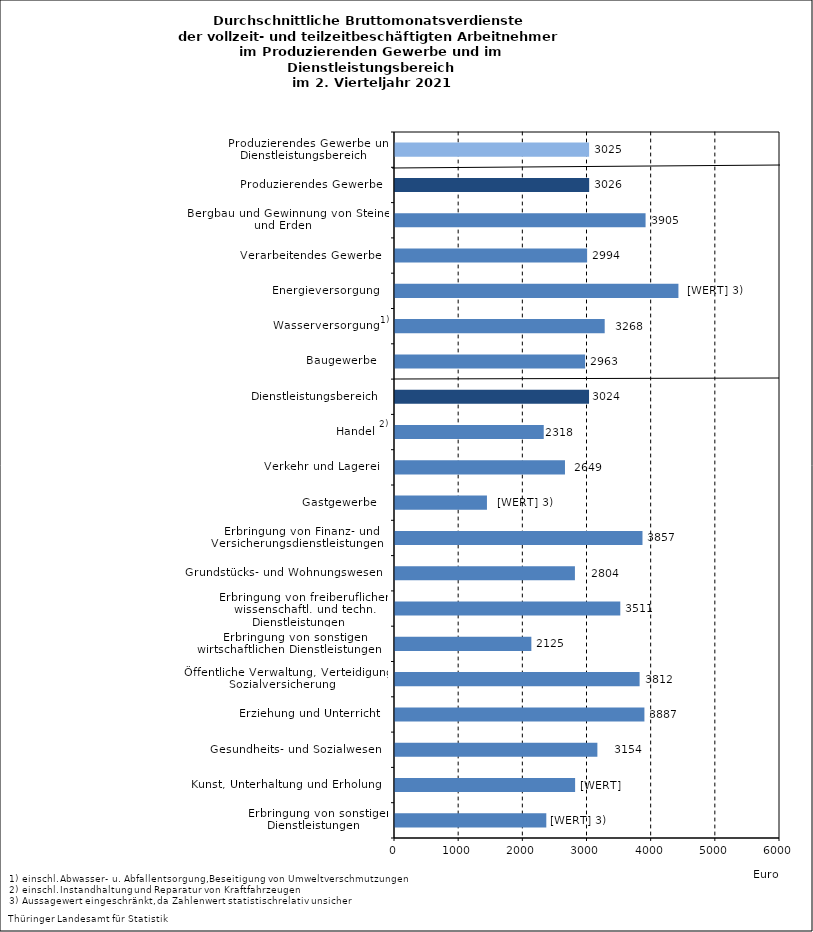
| Category | Series 0 |
|---|---|
| Erbringung von sonstigen Dienstleistungen    | 2358 |
| Kunst, Unterhaltung und Erholung    | 2807 |
| Gesundheits- und Sozialwesen    | 3154 |
| Erziehung und Unterricht    | 3887 |
| Öffentliche Verwaltung, Verteidigung, Sozialversicherung    | 3812 |
| Erbringung von sonstigen wirtschaftlichen Dienstleistungen    | 2125 |
| Erbringung von freiberuflichen, wissenschaftl. und techn. Dienstleistungen    | 3511 |
| Grundstücks- und Wohnungswesen    | 2804 |
| Erbringung von Finanz- und Versicherungsdienstleistungen    | 3857 |
| Gastgewerbe    | 1433 |
| Verkehr und Lagerei    | 2649 |
| Handel    | 2318 |
| Dienstleistungsbereich    | 3024 |
| Baugewerbe    | 2963 |
| Wasserversorgung    | 3268 |
| Energieversorgung    | 4417 |
| Verarbeitendes Gewerbe    | 2994 |
| Bergbau und Gewinnung von Steinen und Erden    | 3905 |
| Produzierendes Gewerbe    | 3026 |
| Produzierendes Gewerbe und Dienstleistungsbereich    | 3025 |